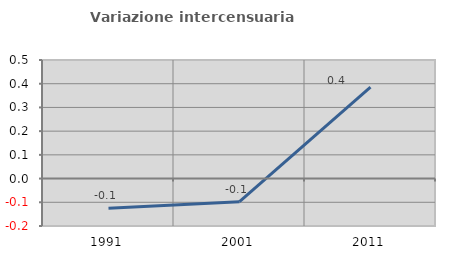
| Category | Variazione intercensuaria annua |
|---|---|
| 1991.0 | -0.125 |
| 2001.0 | -0.097 |
| 2011.0 | 0.385 |